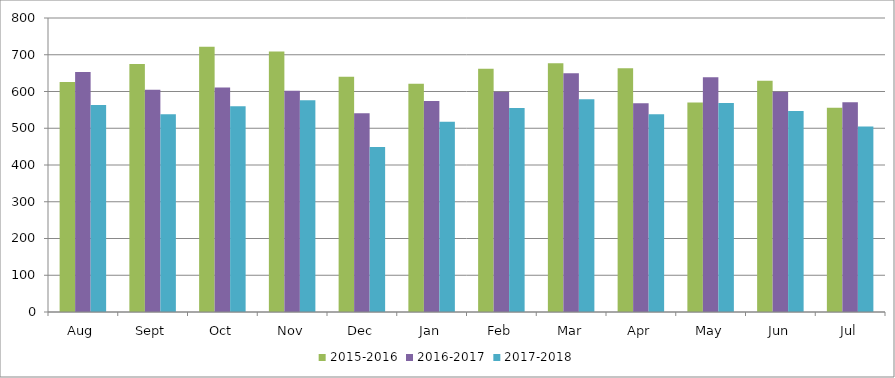
| Category | 2015-2016 | 2016-2017 | 2017-2018 |
|---|---|---|---|
| Aug | 626 | 653 | 563 |
| Sept | 675 | 605 | 538 |
| Oct | 722 | 611 | 560 |
| Nov | 709 | 602 | 576 |
| Dec | 640 | 541 | 449 |
| Jan | 621 | 574 | 518 |
| Feb | 662 | 599 | 555 |
| Mar | 677 | 650 | 579 |
| Apr | 663 | 568 | 538 |
| May | 570 | 639 | 569 |
| Jun | 629 | 599 | 547 |
| Jul | 556 | 571 | 505 |